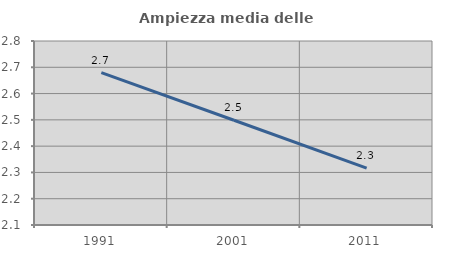
| Category | Ampiezza media delle famiglie |
|---|---|
| 1991.0 | 2.679 |
| 2001.0 | 2.498 |
| 2011.0 | 2.316 |